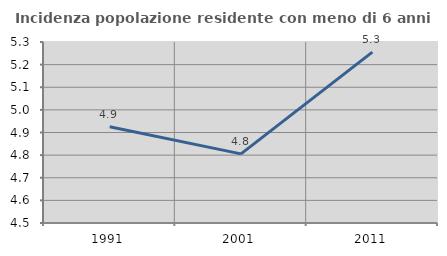
| Category | Incidenza popolazione residente con meno di 6 anni |
|---|---|
| 1991.0 | 4.926 |
| 2001.0 | 4.806 |
| 2011.0 | 5.255 |